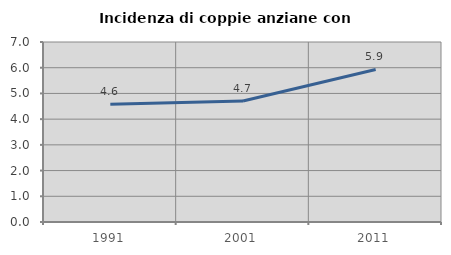
| Category | Incidenza di coppie anziane con figli |
|---|---|
| 1991.0 | 4.584 |
| 2001.0 | 4.707 |
| 2011.0 | 5.931 |